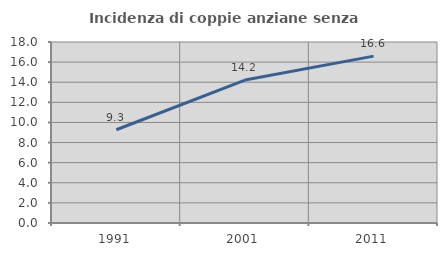
| Category | Incidenza di coppie anziane senza figli  |
|---|---|
| 1991.0 | 9.276 |
| 2001.0 | 14.211 |
| 2011.0 | 16.596 |